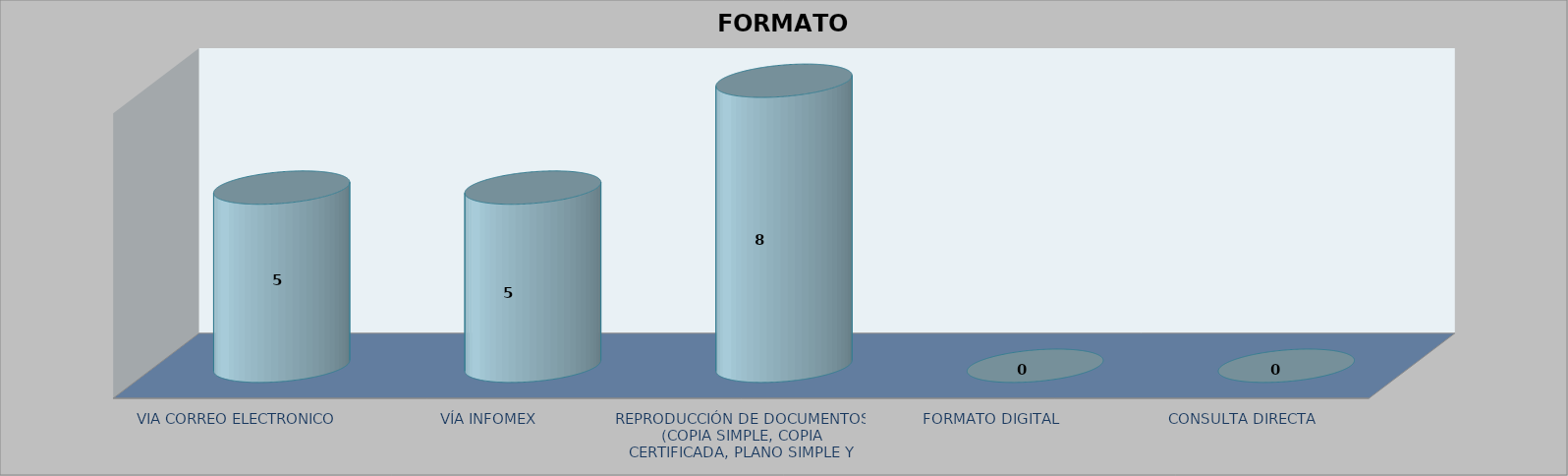
| Category |        FORMATO SOLICITADO | Series 1 | Series 2 |
|---|---|---|---|
| VIA CORREO ELECTRONICO |  |  | 5 |
| VÍA INFOMEX |  |  | 5 |
| REPRODUCCIÓN DE DOCUMENTOS (COPIA SIMPLE, COPIA CERTIFICADA, PLANO SIMPLE Y PLANO CERTIFICADO) |  |  | 8 |
| FORMATO DIGITAL |  |  | 0 |
| CONSULTA DIRECTA |  |  | 0 |